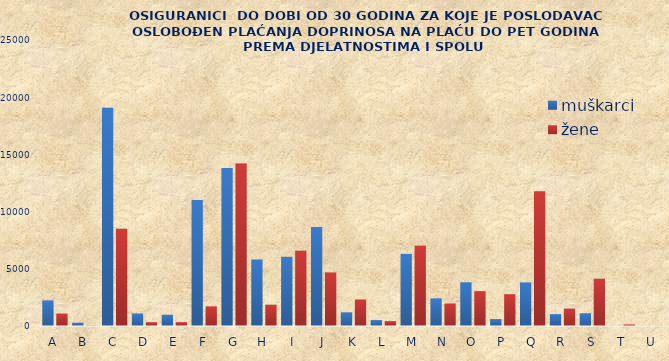
| Category | muškarci | žene |
|---|---|---|
| A | 2240 | 1084 |
| B | 284 | 29 |
| C | 19070 | 8498 |
| D | 1089 | 332 |
| E | 981 | 338 |
| F | 11006 | 1717 |
| G | 13813 | 14196 |
| H | 5816 | 1861 |
| I | 6043 | 6581 |
| J | 8647 | 4683 |
| K | 1197 | 2322 |
| L | 518 | 426 |
| M | 6301 | 7020 |
| N | 2416 | 1962 |
| O | 3824 | 3049 |
| P | 608 | 2780 |
| Q | 3812 | 11775 |
| R | 1038 | 1521 |
| S | 1115 | 4133 |
| T | 21 | 135 |
| U | 10 | 14 |